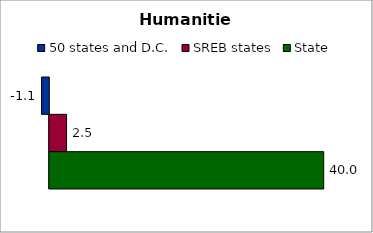
| Category | 50 states and D.C. | SREB states | State |
|---|---|---|---|
| 0 | -1.053 | 2.518 | 40 |